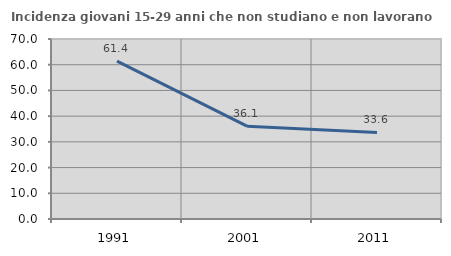
| Category | Incidenza giovani 15-29 anni che non studiano e non lavorano  |
|---|---|
| 1991.0 | 61.392 |
| 2001.0 | 36.103 |
| 2011.0 | 33.643 |